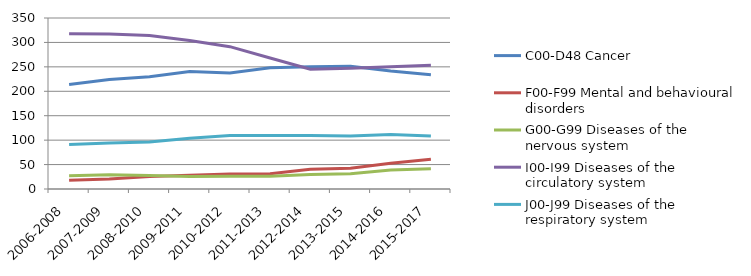
| Category | C00-D48 Cancer | F00-F99 Mental and behavioural disorders | G00-G99 Diseases of the nervous system | I00-I99 Diseases of the circulatory system | J00-J99 Diseases of the respiratory system |
|---|---|---|---|---|---|
| 2006-2008 | 214 | 18 | 27 | 317.667 | 91 |
| 2007-2009 | 224 | 20.667 | 29 | 317 | 94.333 |
| 2008-2010 | 229.667 | 25.333 | 27.667 | 314.333 | 96 |
| 2009-2011 | 240.333 | 28 | 25.667 | 304 | 104 |
| 2010-2012 | 237.333 | 30.667 | 26 | 291.333 | 109.667 |
| 2011-2013 | 248.333 | 31.333 | 26.333 | 268 | 109.667 |
| 2012-2014 | 250.333 | 40.333 | 29.667 | 245.333 | 109.667 |
| 2013-2015 | 251.333 | 42.667 | 31.333 | 247 | 108.667 |
| 2014-2016 | 241.333 | 52.667 | 39 | 250 | 111.667 |
| 2015-2017 | 233.667 | 61 | 41.667 | 253.333 | 108.333 |